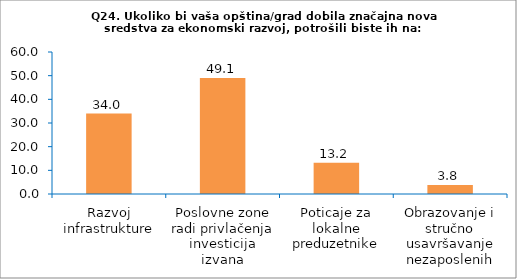
| Category | Series 0 |
|---|---|
| Razvoj infrastrukture | 33.962 |
| Poslovne zone radi privlačenja investicija izvana | 49.057 |
| Poticaje za lokalne preduzetnike | 13.208 |
| Obrazovanje i stručno usavršavanje nezaposlenih | 3.774 |